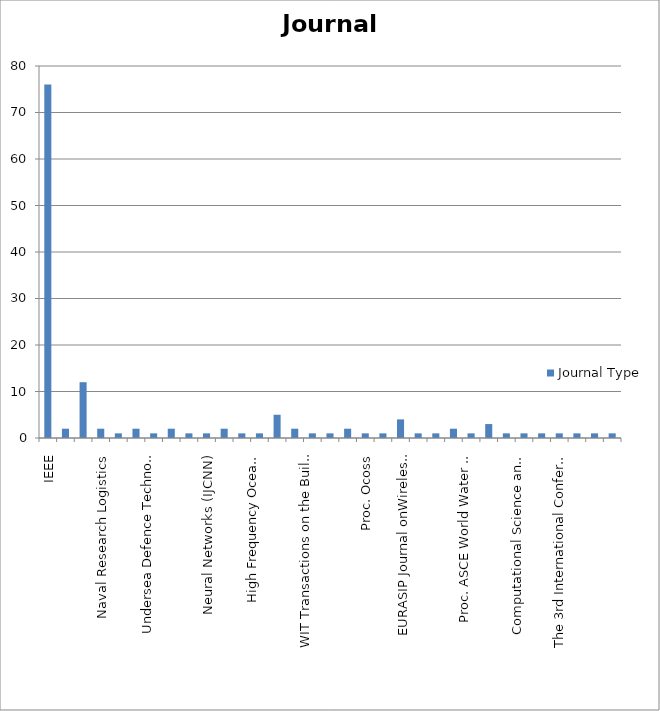
| Category | Journal Type |
|---|---|
| IEEE | 76 |
| J Transp Secur | 2 |
| SPIE | 12 |
| Naval Research Logistics | 2 |
| Operations Research | 1 |
| AIP Conference Proceedings | 2 |
| Undersea Defence Technology Europe, Naples | 1 |
| Ad Hoc Networks | 2 |
| Networks Security, Wireless Communications and Trusted Computing | 1 |
| Neural Networks (IJCNN) | 1 |
| Theoretical Computer Science | 2 |
| Journal of Field Robotics | 1 |
| High Frequency Ocean Acoustics | 1 |
| MTS | 5 |
| European Conference on Synthetic Aperture Radar;  | 2 |
| WIT Transactions on the Built Environment | 1 |
| Fusion  | 1 |
| Computer Communications | 2 |
| Proc. Ocoss | 1 |
| Symposium on Wireless Sensor and Cellular Networks  | 1 |
| ACM (e.gTransactions on Sensor Networks (TOSN) | 4 |
| EURASIP Journal onWireless Communications and Networking | 1 |
| Proceedings of the American Control Conference | 1 |
| Wireless Communications and Mobile Computing | 2 |
| Proc. ASCE World Water Environ. Resources Congr | 1 |
| Journal of Water Resources Planning and Management, | 3 |
| Journal of Infrastructure Systems | 1 |
| Computational Science and Optimization (CSO) | 1 |
| IWA International Conference on Efficient Use and Management of Water  | 1 |
| Computers & chemical engineering | 1 |
| The 3rd International Conference on Circuits, Systems Communication and Computers | 1 |
| Journal of Applied Geophysics | 1 |
| Philosophical Transactions of the Royal Society A: Mathematical,Physical and Engineering Sciences | 1 |